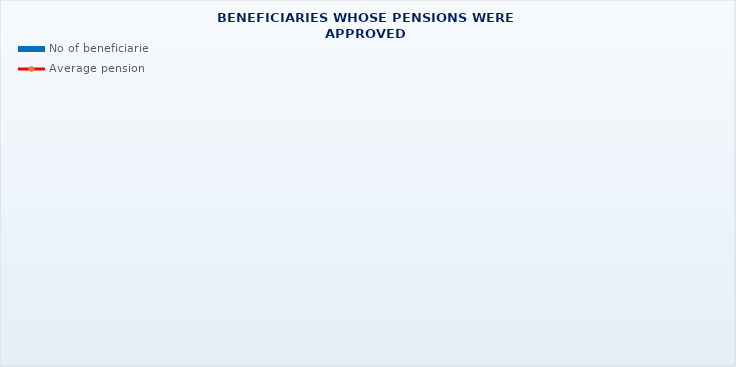
| Category | No of beneficiaries |
|---|---|
| Authorised officials in internal affairs, judicial officers and workers engaged in demining work: | 17264 |
| Active military personnel - DVO  | 15627 |
| Croatian Homeland Army veterans mobilised from 1941 to 1945 | 3902 |
| Former political prisoners | 2776 |
| Croatian Veterans from the Homeland War - ZOHBDR (Act on the Rights of Croatian Homeland War Veterans and their Family Members) | 71245 |
| Pensions approved under general regulations and determined according to the Act on the Rights of Croatian Homeland War Veterans and their Family Members (ZOHBDR), in 2017 (Art. 27, 35, 48 and 49, paragraph 2)    | 43258 |
| Former Yugoslav People's Army members - JNA   | 5337 |
| Former Yugoslav People's Army members - JNA - Art. 185 of Pension Insurance Act (ZOMO)  | 143 |
| National Liberation War veterans - NOR | 9355 |
| Members of the Croatian Parliament, members of the Government, judges of the Constitutional Court and the Auditor General | 673 |
| Members of the Parliamentary Executive Council and administratively retired federal civil servants  (relates to the former SFRY) | 93 |
| Former officials of federal bodies o the former SFRJ -  Article 38 of the Pension Insurance Act (ZOMO) | 31 |
| Full members of the Croatian Academy of Sciences and Arts - HAZU | 140 |
| Miners from the Istrian coal mines "Tupljak" d.d. Labin  | 254 |
| Workers professionally exposed to asbestos | 866 |
| Insurees - crew members on a ship in international and national navigation  - Article  129, paragraph 2 of the Maritime Code | 182 |
| Members of the Croatian Defence Council - HVO  | 6725 |